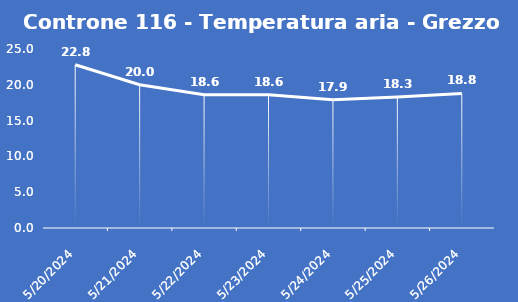
| Category | Controne 116 - Temperatura aria - Grezzo (°C) |
|---|---|
| 5/20/24 | 22.8 |
| 5/21/24 | 20 |
| 5/22/24 | 18.6 |
| 5/23/24 | 18.6 |
| 5/24/24 | 17.9 |
| 5/25/24 | 18.3 |
| 5/26/24 | 18.8 |